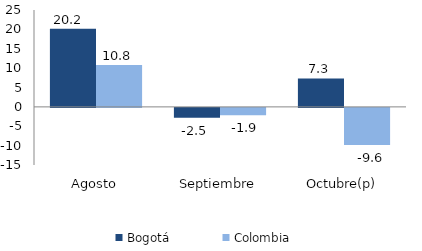
| Category | Bogotá | Colombia |
|---|---|---|
| Agosto | 20.168 | 10.813 |
| Septiembre | -2.541 | -1.877 |
| Octubre(p) | 7.348 | -9.595 |